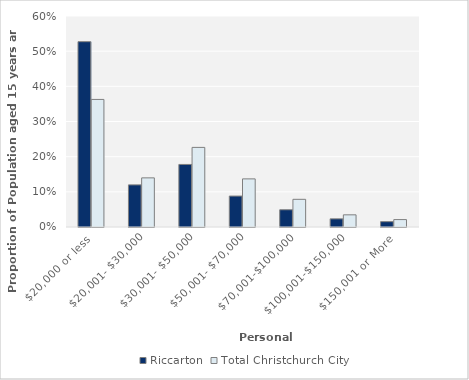
| Category | Riccarton | Total Christchurch City |
|---|---|---|
| $20,000 or less | 0.527 | 0.363 |
| $20,001- $30,000 | 0.12 | 0.14 |
| $30,001- $50,000 | 0.178 | 0.226 |
| $50,001- $70,000 | 0.088 | 0.137 |
| $70,001-$100,000 | 0.049 | 0.079 |
| $100,001-$150,000 | 0.023 | 0.035 |
| $150,001 or More | 0.015 | 0.021 |